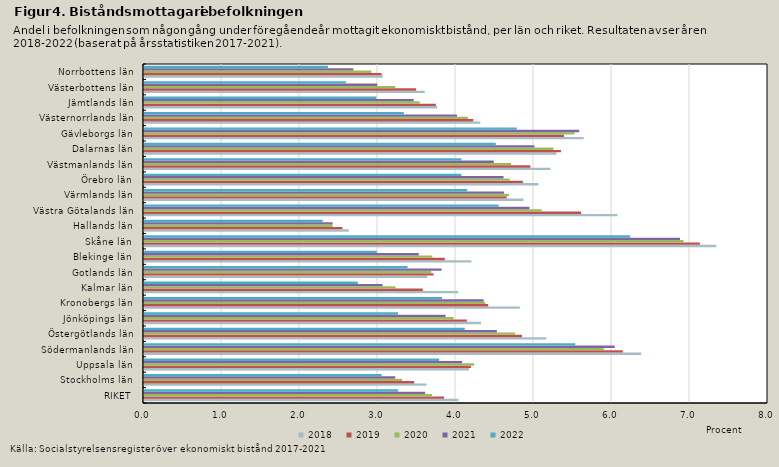
| Category | 2018 | 2019 | 2020 | 2021 | 2022 |
|---|---|---|---|---|---|
| RIKET | 4.032 | 3.848 | 3.691 | 3.604 | 3.259 |
| Stockholms län | 3.622 | 3.464 | 3.31 | 3.22 | 3.047 |
| Uppsala län | 4.166 | 4.191 | 4.232 | 4.079 | 3.785 |
| Södermanlands län | 6.375 | 6.138 | 5.895 | 6.035 | 5.529 |
| Östergötlands län | 5.159 | 4.845 | 4.756 | 4.524 | 4.112 |
| Jönköpings län | 4.32 | 4.139 | 3.969 | 3.866 | 3.257 |
| Kronobergs län | 4.818 | 4.413 | 4.373 | 4.354 | 3.821 |
| Kalmar län | 4.029 | 3.574 | 3.225 | 3.058 | 2.741 |
| Gotlands län | 3.632 | 3.711 | 3.683 | 3.815 | 3.379 |
| Blekinge län | 4.197 | 3.856 | 3.696 | 3.522 | 2.984 |
| Skåne län | 7.338 | 7.125 | 6.918 | 6.872 | 6.234 |
| Hallands län | 2.626 | 2.544 | 2.418 | 2.417 | 2.29 |
| Västra Götalands län | 6.068 | 5.603 | 5.099 | 4.941 | 4.545 |
| Värmlands län | 4.863 | 4.649 | 4.679 | 4.617 | 4.143 |
| Örebro län | 5.056 | 4.857 | 4.689 | 4.609 | 4.069 |
| Västmanlands län | 5.211 | 4.953 | 4.707 | 4.484 | 4.07 |
| Dalarnas län | 5.287 | 5.345 | 5.249 | 5.005 | 4.51 |
| Gävleborgs län | 5.637 | 5.384 | 5.52 | 5.579 | 4.778 |
| Västernorrlands län | 4.312 | 4.22 | 4.152 | 4.012 | 3.331 |
| Jämtlands län | 3.759 | 3.741 | 3.536 | 3.458 | 2.979 |
| Västerbottens län | 3.599 | 3.489 | 3.221 | 2.989 | 2.587 |
| Norrbottens län | 3.061 | 3.046 | 2.915 | 2.684 | 2.358 |